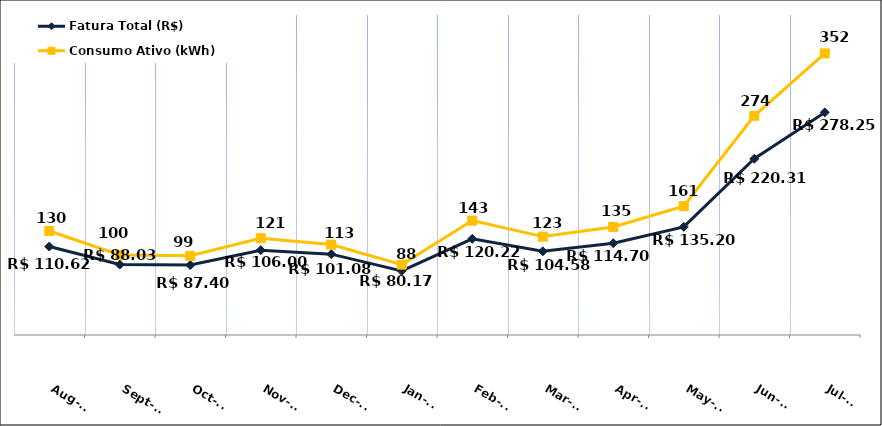
| Category | Fatura Total (R$) |
|---|---|
| 2023-08-01 | 110.62 |
| 2023-09-01 | 88.03 |
| 2023-10-01 | 87.4 |
| 2023-11-01 | 106 |
| 2023-12-01 | 101.08 |
| 2024-01-01 | 80.17 |
| 2024-02-01 | 120.22 |
| 2024-03-01 | 104.58 |
| 2024-04-01 | 114.7 |
| 2024-05-01 | 135.2 |
| 2024-06-01 | 220.31 |
| 2024-07-01 | 278.25 |